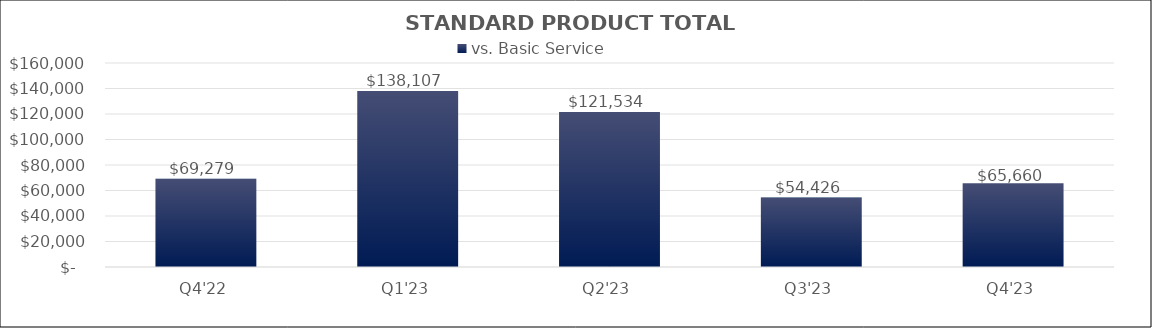
| Category | vs. Basic Service |
|---|---|
| Q4'22 | 69278.733 |
| Q1'23 | 138107.123 |
| Q2'23 | 121533.896 |
| Q3'23 | 54426.289 |
| Q4'23 | 65660.41 |